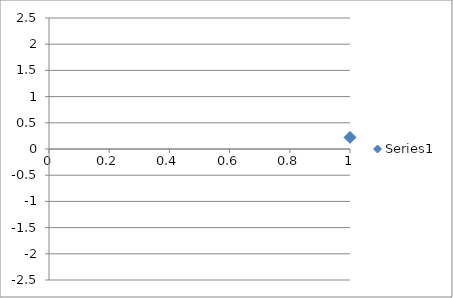
| Category | Series 0 |
|---|---|
| 0 | 0.221 |
| 1 | 1.782 |
| 2 | 1.606 |
| 3 | -0.216 |
| 4 | 1.389 |
| 5 | -1.267 |
| 6 | 0.18 |
| 7 | -0.309 |
| 8 | 1.885 |
| 9 | -0.144 |
| 10 | 1.207 |
| 11 | 1.017 |
| 12 | 0.382 |
| 13 | 0.35 |
| 14 | 0.537 |
| 15 | -1.512 |
| 16 | 0.212 |
| 17 | -0.202 |
| 18 | 0.404 |
| 19 | 0.679 |
| 20 | -0.102 |
| 21 | -0.667 |
| 22 | 0.394 |
| 23 | -0.867 |
| 24 | 0.362 |
| 25 | -0.036 |
| 26 | -0.825 |
| 27 | -1.431 |
| 28 | -1.454 |
| 29 | 1.397 |
| 30 | -1.265 |
| 31 | -2.093 |
| 32 | 0.438 |
| 33 | -0.717 |
| 34 | -0.182 |
| 35 | -0.644 |
| 36 | 1.959 |
| 37 | 0.826 |
| 38 | 0.537 |
| 39 | 1.503 |
| 40 | -0.807 |
| 41 | 0.912 |
| 42 | 0.663 |
| 43 | -0.453 |
| 44 | -1.537 |
| 45 | -0.783 |
| 46 | -0.667 |
| 47 | -1.347 |
| 48 | -1.489 |
| 49 | -0.548 |
| 50 | -0.311 |
| 51 | 0.975 |
| 52 | 0.89 |
| 53 | -0.186 |
| 54 | -0.972 |
| 55 | -1.248 |
| 56 | 1.671 |
| 57 | -0.494 |
| 58 | 0.185 |
| 59 | 0.214 |